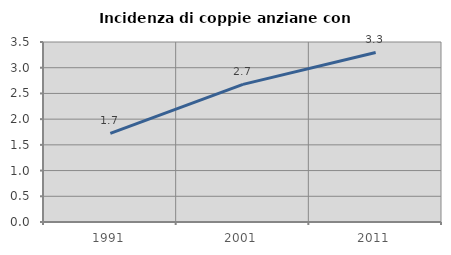
| Category | Incidenza di coppie anziane con figli |
|---|---|
| 1991.0 | 1.723 |
| 2001.0 | 2.676 |
| 2011.0 | 3.297 |